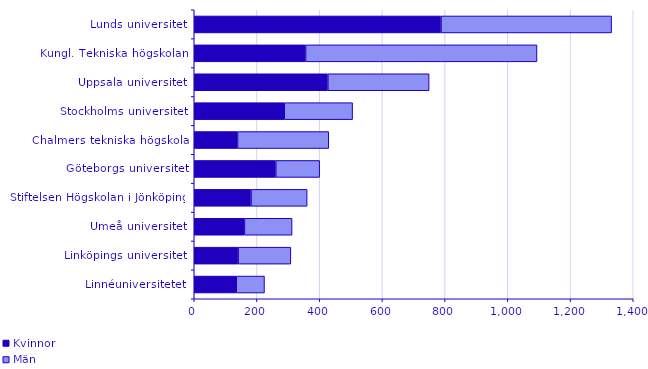
| Category | Kvinnor | Män |
|---|---|---|
| Linnéuniversitetet | 134 | 90 |
| Linköpings universitet | 140 | 168 |
| Umeå universitet | 160 | 152 |
| Stiftelsen Högskolan i Jönköping | 181 | 179 |
| Göteborgs universitet | 260 | 140 |
| Chalmers tekniska högskola | 138 | 291 |
| Stockholms universitet | 287 | 218 |
| Uppsala universitet | 426 | 323 |
| Kungl. Tekniska högskolan | 355 | 738 |
| Lunds universitet | 787 | 544 |